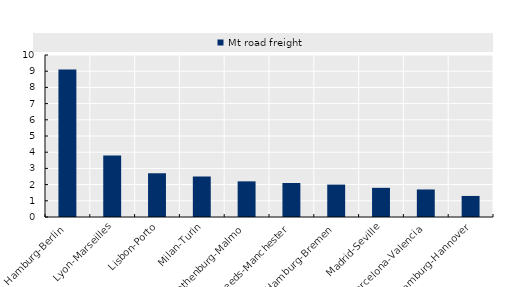
| Category | Mt road freight |
|---|---|
| Hamburg-Berlin | 9.1 |
| Lyon-Marseilles | 3.8 |
| Lisbon-Porto | 2.7 |
| Milan-Turin | 2.5 |
| Gothenburg-Malmo | 2.2 |
| Leeds-Manchester | 2.1 |
| Hamburg-Bremen | 2 |
| Madrid-Seville | 1.8 |
| Barcelona-Valencia | 1.7 |
| Hamburg-Hannover | 1.3 |